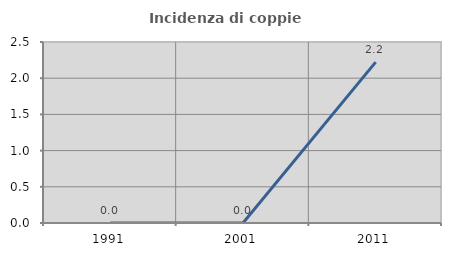
| Category | Incidenza di coppie miste |
|---|---|
| 1991.0 | 0 |
| 2001.0 | 0 |
| 2011.0 | 2.222 |